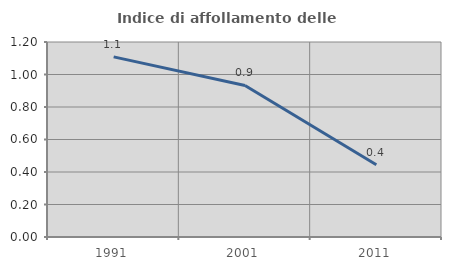
| Category | Indice di affollamento delle abitazioni  |
|---|---|
| 1991.0 | 1.109 |
| 2001.0 | 0.933 |
| 2011.0 | 0.444 |